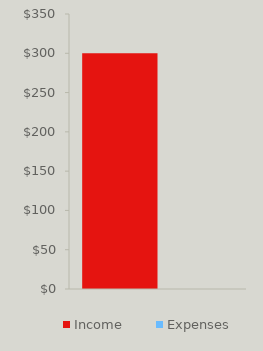
| Category | Income | Expenses |
|---|---|---|
| 0 | 300 | 0 |